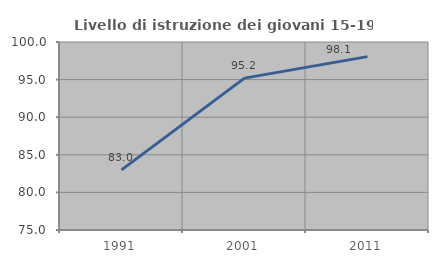
| Category | Livello di istruzione dei giovani 15-19 anni |
|---|---|
| 1991.0 | 83.002 |
| 2001.0 | 95.194 |
| 2011.0 | 98.057 |